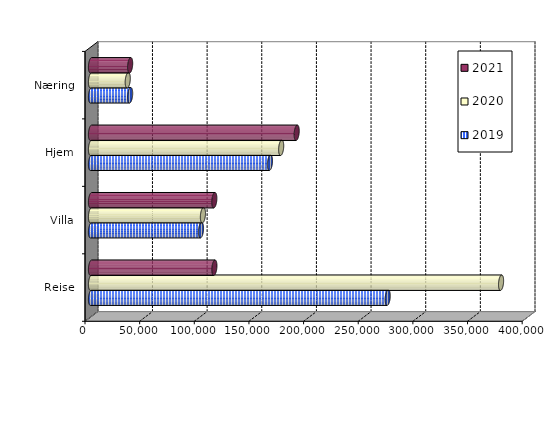
| Category | 2019 | 2020 | 2021 |
|---|---|---|---|
| Reise | 271454.894 | 375186 | 112892.846 |
| Villa | 100639.434 | 102401.976 | 112820.346 |
| Hjem | 163732.571 | 173987.33 | 188188.29 |
| Næring | 35803.787 | 33616.306 | 35814.895 |